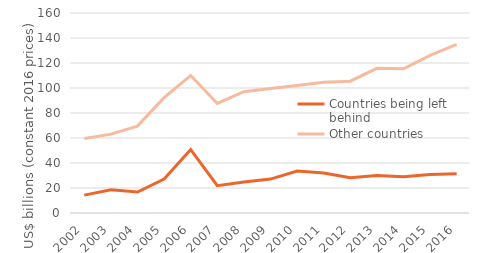
| Category | Countries being left behind | Other countries |
|---|---|---|
| 2002.0 | 14.318 | 59.577 |
| 2003.0 | 18.503 | 63.082 |
| 2004.0 | 16.805 | 69.5 |
| 2005.0 | 27.214 | 92.258 |
| 2006.0 | 50.772 | 109.972 |
| 2007.0 | 21.816 | 87.621 |
| 2008.0 | 24.732 | 97.046 |
| 2009.0 | 27.146 | 99.627 |
| 2010.0 | 33.512 | 102.043 |
| 2011.0 | 32.058 | 104.553 |
| 2012.0 | 28.298 | 105.462 |
| 2013.0 | 30.068 | 115.745 |
| 2014.0 | 28.906 | 115.389 |
| 2015.0 | 30.851 | 126.101 |
| 2016.0 | 31.498 | 134.829 |